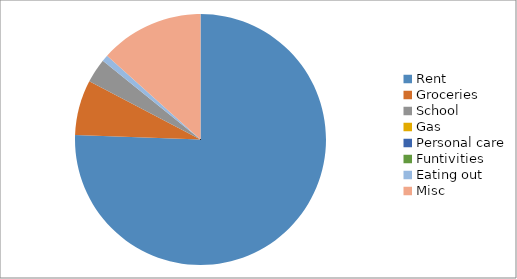
| Category | Series 0 |
|---|---|
| Rent | 362 |
| Groceries | 34 |
| School | 15 |
| Gas | 0 |
| Personal care | 0 |
| Funtivities | 0 |
| Eating out | 4 |
| Misc | 64 |